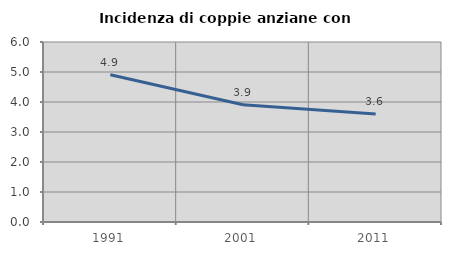
| Category | Incidenza di coppie anziane con figli |
|---|---|
| 1991.0 | 4.908 |
| 2001.0 | 3.906 |
| 2011.0 | 3.601 |